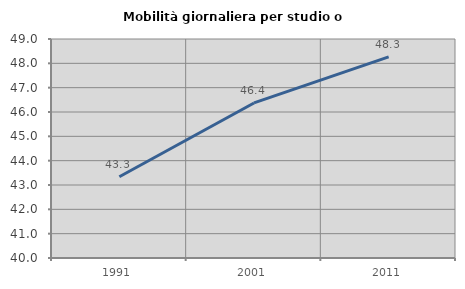
| Category | Mobilità giornaliera per studio o lavoro |
|---|---|
| 1991.0 | 43.341 |
| 2001.0 | 46.372 |
| 2011.0 | 48.264 |